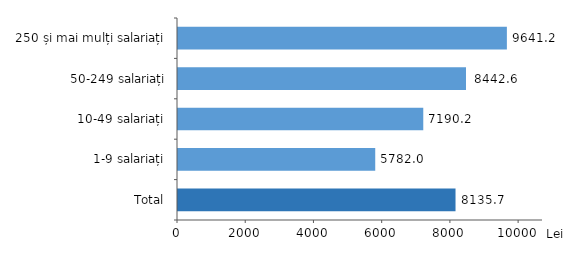
| Category | Series 0 |
|---|---|
| Total | 8135.7 |
| 1-9 salariați | 5782 |
| 10-49 salariați | 7190.2 |
| 50-249 salariați | 8442.6 |
| 250 și mai mulți salariați | 9641.2 |